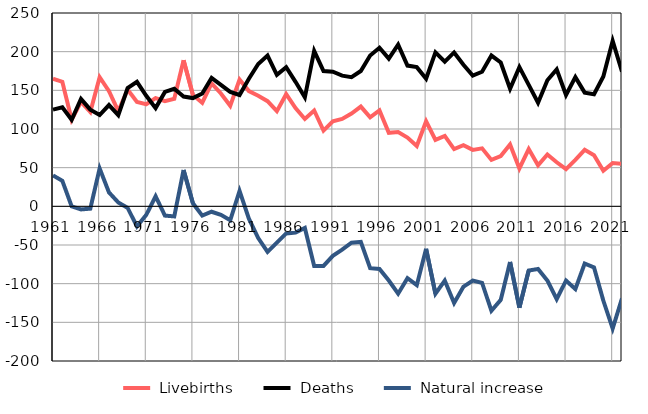
| Category |  Livebirths |  Deaths |  Natural increase |
|---|---|---|---|
| 1961.0 | 165 | 125 | 40 |
| 1962.0 | 161 | 128 | 33 |
| 1963.0 | 112 | 112 | 0 |
| 1964.0 | 135 | 139 | -4 |
| 1965.0 | 122 | 125 | -3 |
| 1966.0 | 167 | 118 | 49 |
| 1967.0 | 149 | 131 | 18 |
| 1968.0 | 123 | 118 | 5 |
| 1969.0 | 151 | 153 | -2 |
| 1970.0 | 135 | 161 | -26 |
| 1971.0 | 132 | 143 | -11 |
| 1972.0 | 140 | 127 | 13 |
| 1973.0 | 136 | 148 | -12 |
| 1974.0 | 139 | 152 | -13 |
| 1975.0 | 189 | 142 | 47 |
| 1976.0 | 144 | 140 | 4 |
| 1977.0 | 134 | 146 | -12 |
| 1978.0 | 159 | 166 | -7 |
| 1979.0 | 146 | 157 | -11 |
| 1980.0 | 130 | 148 | -18 |
| 1981.0 | 164 | 144 | 20 |
| 1982.0 | 149 | 165 | -16 |
| 1983.0 | 143 | 184 | -41 |
| 1984.0 | 136 | 195 | -59 |
| 1985.0 | 123 | 170 | -47 |
| 1986.0 | 145 | 180 | -35 |
| 1987.0 | 127 | 161 | -34 |
| 1988.0 | 113 | 141 | -28 |
| 1989.0 | 124 | 201 | -77 |
| 1990.0 | 98 | 175 | -77 |
| 1991.0 | 110 | 174 | -64 |
| 1992.0 | 113 | 169 | -56 |
| 1993.0 | 120 | 167 | -47 |
| 1994.0 | 129 | 175 | -46 |
| 1995.0 | 115 | 195 | -80 |
| 1996.0 | 124 | 205 | -81 |
| 1997.0 | 95 | 191 | -96 |
| 1998.0 | 96 | 209 | -113 |
| 1999.0 | 89 | 182 | -93 |
| 2000.0 | 78 | 180 | -102 |
| 2001.0 | 110 | 165 | -55 |
| 2002.0 | 86 | 199 | -113 |
| 2003.0 | 91 | 187 | -96 |
| 2004.0 | 74 | 199 | -125 |
| 2005.0 | 79 | 183 | -104 |
| 2006.0 | 73 | 169 | -96 |
| 2007.0 | 75 | 174 | -99 |
| 2008.0 | 60 | 195 | -135 |
| 2009.0 | 65 | 186 | -121 |
| 2010.0 | 80 | 152 | -72 |
| 2011.0 | 49 | 180 | -131 |
| 2012.0 | 74 | 157 | -83 |
| 2013.0 | 53 | 134 | -81 |
| 2014.0 | 67 | 163 | -96 |
| 2015.0 | 57 | 177 | -120 |
| 2016.0 | 48 | 144 | -96 |
| 2017.0 | 60 | 167 | -107 |
| 2018.0 | 73 | 147 | -74 |
| 2019.0 | 66 | 145 | -79 |
| 2020.0 | 46 | 168 | -122 |
| 2021.0 | 56 | 214 | -158 |
| 2022.0 | 55 | 174 | -119 |